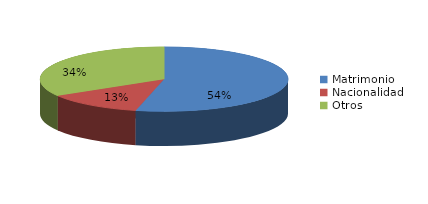
| Category | Series 0 |
|---|---|
| Matrimonio | 711 |
| Nacionalidad | 168 |
| Otros | 446 |